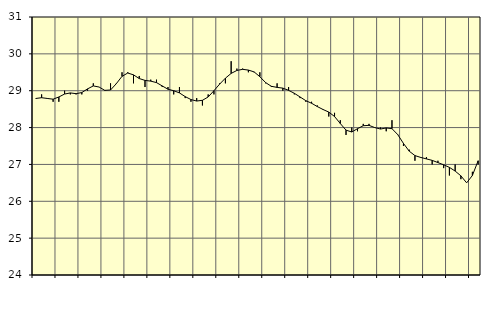
| Category | Piggar | Series 1 |
|---|---|---|
| nan | 28.8 | 28.79 |
| 1.0 | 28.9 | 28.81 |
| 1.0 | 28.8 | 28.79 |
| 1.0 | 28.7 | 28.77 |
| nan | 28.7 | 28.83 |
| 2.0 | 29 | 28.91 |
| 2.0 | 28.9 | 28.94 |
| 2.0 | 28.9 | 28.92 |
| nan | 28.9 | 28.95 |
| 3.0 | 29 | 29.05 |
| 3.0 | 29.2 | 29.13 |
| 3.0 | 29.1 | 29.1 |
| nan | 29 | 29.01 |
| 4.0 | 29.2 | 29.02 |
| 4.0 | 29.2 | 29.19 |
| 4.0 | 29.5 | 29.39 |
| nan | 29.5 | 29.48 |
| 5.0 | 29.2 | 29.43 |
| 5.0 | 29.4 | 29.33 |
| 5.0 | 29.1 | 29.28 |
| nan | 29.3 | 29.26 |
| 6.0 | 29.3 | 29.22 |
| 6.0 | 29.1 | 29.13 |
| 6.0 | 29.1 | 29.04 |
| nan | 28.9 | 29 |
| 7.0 | 29.1 | 28.94 |
| 7.0 | 28.8 | 28.84 |
| 7.0 | 28.7 | 28.76 |
| nan | 28.8 | 28.72 |
| 8.0 | 28.6 | 28.74 |
| 8.0 | 28.9 | 28.83 |
| 8.0 | 28.9 | 29 |
| nan | 29.2 | 29.18 |
| 9.0 | 29.2 | 29.34 |
| 9.0 | 29.8 | 29.47 |
| 9.0 | 29.6 | 29.55 |
| nan | 29.6 | 29.58 |
| 10.0 | 29.5 | 29.56 |
| 10.0 | 29.5 | 29.51 |
| 10.0 | 29.5 | 29.38 |
| nan | 29.2 | 29.22 |
| 11.0 | 29.1 | 29.12 |
| 11.0 | 29.2 | 29.09 |
| 11.0 | 29 | 29.07 |
| nan | 29.1 | 29.01 |
| 12.0 | 28.9 | 28.93 |
| 12.0 | 28.8 | 28.83 |
| 12.0 | 28.7 | 28.73 |
| nan | 28.7 | 28.66 |
| 13.0 | 28.6 | 28.57 |
| 13.0 | 28.5 | 28.49 |
| 13.0 | 28.3 | 28.42 |
| nan | 28.4 | 28.3 |
| 14.0 | 28.2 | 28.11 |
| 14.0 | 27.8 | 27.93 |
| 14.0 | 28 | 27.88 |
| nan | 27.9 | 27.97 |
| 15.0 | 28.1 | 28.05 |
| 15.0 | 28.1 | 28.06 |
| 15.0 | 28 | 28 |
| nan | 28 | 27.96 |
| 16.0 | 27.9 | 27.99 |
| 16.0 | 28.2 | 27.97 |
| 16.0 | 27.8 | 27.81 |
| nan | 27.5 | 27.57 |
| 17.0 | 27.4 | 27.36 |
| 17.0 | 27.1 | 27.24 |
| 17.0 | 27.2 | 27.19 |
| nan | 27.2 | 27.15 |
| 18.0 | 27 | 27.11 |
| 18.0 | 27.1 | 27.05 |
| 18.0 | 26.9 | 26.99 |
| nan | 26.7 | 26.92 |
| 19.0 | 27 | 26.82 |
| 19.0 | 26.6 | 26.69 |
| 19.0 | 26.5 | 26.5 |
| nan | 26.8 | 26.7 |
| 20.0 | 27 | 27.1 |